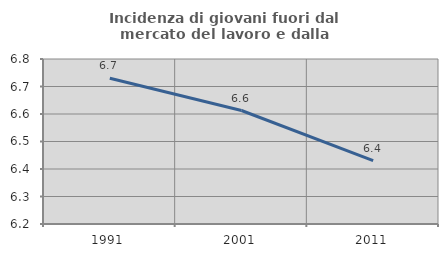
| Category | Incidenza di giovani fuori dal mercato del lavoro e dalla formazione  |
|---|---|
| 1991.0 | 6.73 |
| 2001.0 | 6.613 |
| 2011.0 | 6.43 |